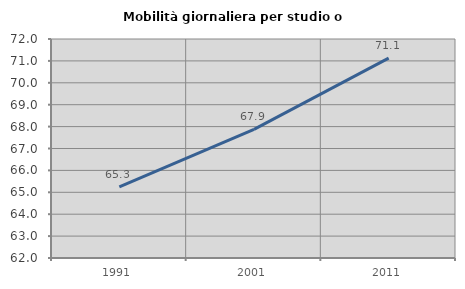
| Category | Mobilità giornaliera per studio o lavoro |
|---|---|
| 1991.0 | 65.251 |
| 2001.0 | 67.875 |
| 2011.0 | 71.124 |